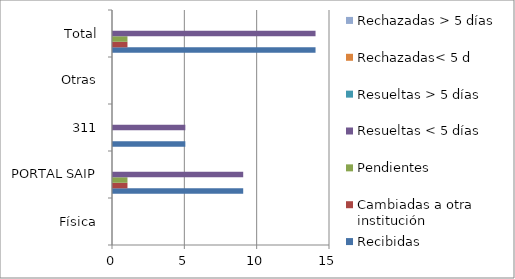
| Category | Recibidas | Cambiadas a otra institución | Pendientes | Resueltas < 5 días | Resueltas > 5 días | Rechazadas< 5 d | Rechazadas > 5 días |
|---|---|---|---|---|---|---|---|
| Física | 0 | 0 | 0 | 0 | 0 | 0 | 0 |
| PORTAL SAIP | 9 | 1 | 1 | 9 | 0 | 0 | 0 |
| 311 | 5 | 0 | 0 | 5 | 0 | 0 | 0 |
| Otras | 0 | 0 | 0 | 0 | 0 | 0 | 0 |
| Total | 14 | 1 | 1 | 14 | 0 | 0 | 0 |